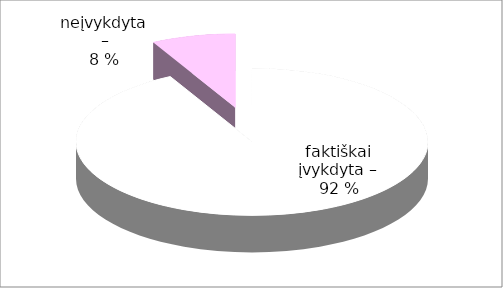
| Category | Series 0 |
|---|---|
| 0 | 12 |
| 1 | 1 |